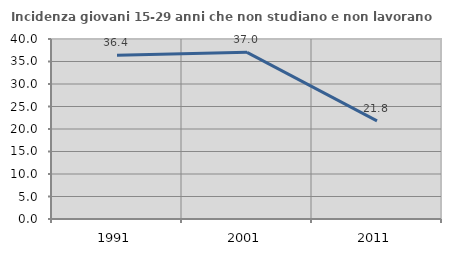
| Category | Incidenza giovani 15-29 anni che non studiano e non lavorano  |
|---|---|
| 1991.0 | 36.364 |
| 2001.0 | 37.037 |
| 2011.0 | 21.795 |